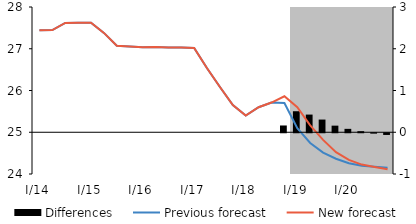
| Category | Differences |
|---|---|
| 0 | 0 |
| 1 | 0 |
| 2 | 0 |
| 3 | 0 |
| 4 | 0 |
| 5 | 0 |
| 6 | 0 |
| 7 | 0 |
| 8 | 0 |
| 9 | 0 |
| 10 | 0 |
| 11 | 0 |
| 12 | 0 |
| 13 | 0 |
| 14 | 0 |
| 15 | 0 |
| 16 | 0 |
| 17 | 0 |
| 18 | 0 |
| 19 | 0.162 |
| 20 | 0.503 |
| 21 | 0.423 |
| 22 | 0.304 |
| 23 | 0.158 |
| 24 | 0.081 |
| 25 | 0.026 |
| 26 | -0.009 |
| 27 | -0.041 |